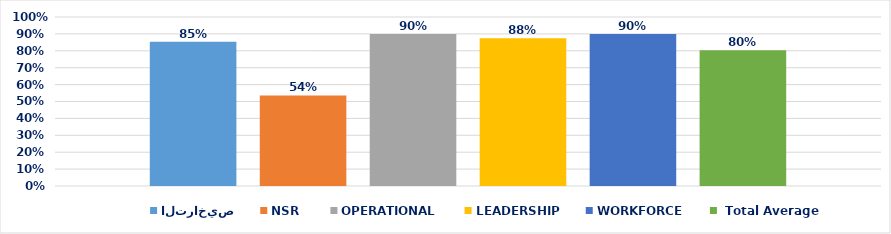
| Category | التراخيص | NSR | OPERATIONAL  | LEADERSHIP | WORKFORCE |  Total Average |
|---|---|---|---|---|---|---|
| 0 | 0.853 | 0.536 | 0.9 | 0.875 | 0.9 | 0.803 |